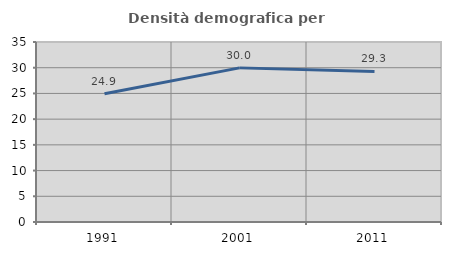
| Category | Densità demografica |
|---|---|
| 1991.0 | 24.946 |
| 2001.0 | 29.969 |
| 2011.0 | 29.288 |